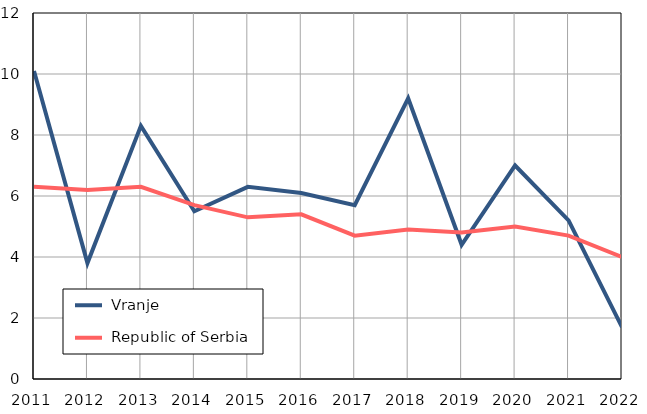
| Category |  Vranje |  Republic of Serbia |
|---|---|---|
| 2011.0 | 10.1 | 6.3 |
| 2012.0 | 3.8 | 6.2 |
| 2013.0 | 8.3 | 6.3 |
| 2014.0 | 5.5 | 5.7 |
| 2015.0 | 6.3 | 5.3 |
| 2016.0 | 6.1 | 5.4 |
| 2017.0 | 5.7 | 4.7 |
| 2018.0 | 9.2 | 4.9 |
| 2019.0 | 4.4 | 4.8 |
| 2020.0 | 7 | 5 |
| 2021.0 | 5.2 | 4.7 |
| 2022.0 | 1.7 | 4 |